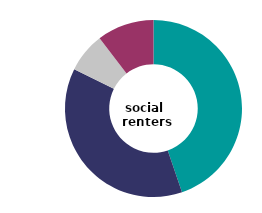
| Category | social 
renters |
|---|---|
| very satisfied | 44.78 |
| fairly satisfied | 37.552 |
| neither satisfied nor dissatisfied | 7.247 |
| slightly or very dissatisfied | 10.421 |